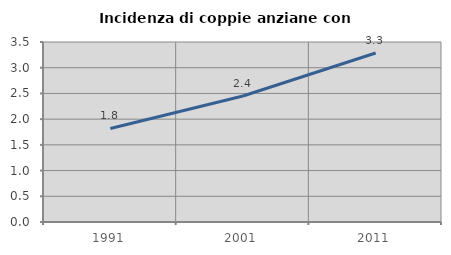
| Category | Incidenza di coppie anziane con figli |
|---|---|
| 1991.0 | 1.818 |
| 2001.0 | 2.45 |
| 2011.0 | 3.286 |